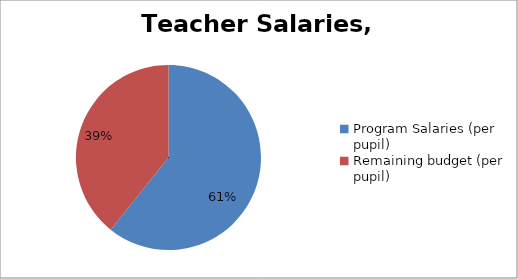
| Category | Series 0 |
|---|---|
| Program Salaries (per pupil) | 8721.547 |
| Remaining budget (per pupil) | 5633.276 |